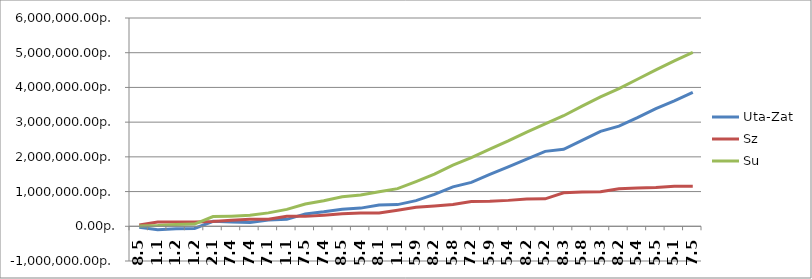
| Category | Uta-Zat | Sz | Su |
|---|---|---|---|
| 8.5 | -29597 | 40000 | 10403 |
| 1.1 | -97710 | 120000 | 22290 |
| 1.2 | -68625 | 120000 | 51375 |
| 1.2 | -61458 | 125555 | 64097 |
| 2.1 | 143930 | 135555 | 279485 |
| 7.4 | 122094 | 170555 | 292649 |
| 7.4 | 111312 | 205555 | 316867 |
| 7.1 | 181039 | 205555 | 386594 |
| 1.1 | 200460 | 285555 | 486015 |
| 7.5 | 357046 | 285555 | 642601 |
| 7.4 | 415979 | 320555 | 736534 |
| 8.5 | 488279 | 360555 | 848834 |
| 5.4 | 523682 | 380555 | 904237 |
| 8.1 | 615985 | 380555 | 996540 |
| 1.1 | 624474 | 460555 | 1085029 |
| 5.9 | 738333 | 550555 | 1288888 |
| 8.2 | 916788 | 586955 | 1503743 |
| 5.8 | 1135655 | 626955 | 1762610 |
| 7.2 | 1264067 | 716955 | 1981022 |
| 5.9 | 1496109 | 723355 | 2219464 |
| 5.4 | 1712887 | 746355 | 2459242 |
| 8.2 | 1931732 | 782755 | 2714487 |
| 5.2 | 2157999 | 791755 | 2949754 |
| 8.3 | 2217526 | 966755 | 3184281 |
| 5.8 | 2474778 | 986755 | 3461533 |
| 5.3 | 2736268 | 992755 | 3729023 |
| 8.2 | 2883978 | 1082755 | 3966733 |
| 5.4 | 3129448 | 1105755 | 4235203 |
| 5.5 | 3390922 | 1115755 | 4506677 |
| 5.1 | 3613116 | 1152155 | 4765271 |
| 7.5 | 3858230 | 1152155 | 5010385 |